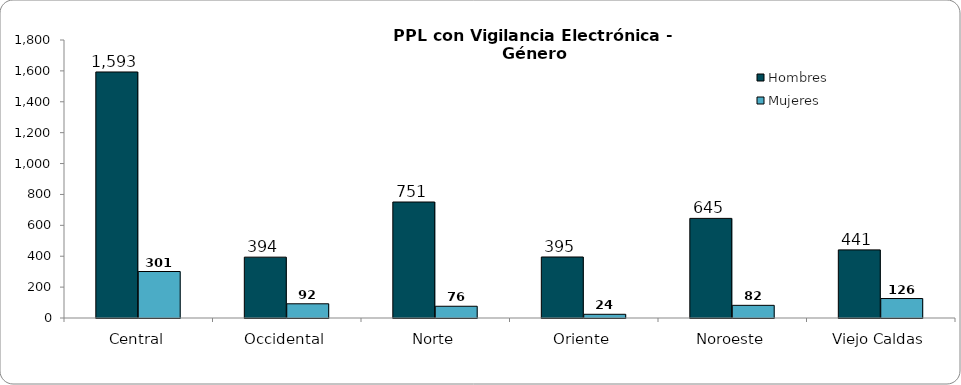
| Category | Hombres | Mujeres |
|---|---|---|
| Central | 1593 | 301 |
| Occidental | 394 | 92 |
| Norte | 751 | 76 |
| Oriente | 395 | 24 |
| Noroeste | 645 | 82 |
| Viejo Caldas | 441 | 126 |